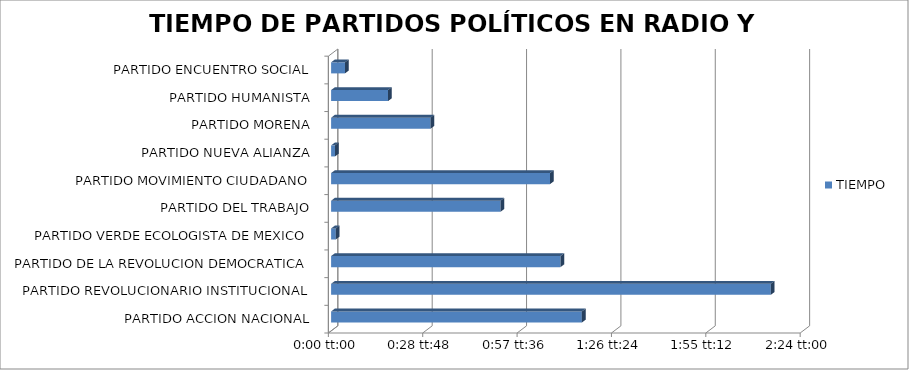
| Category | TIEMPO  |
|---|---|
| PARTIDO ACCION NACIONAL | 0.053 |
| PARTIDO REVOLUCIONARIO INSTITUCIONAL | 0.093 |
| PARTIDO DE LA REVOLUCION DEMOCRATICA | 0.049 |
| PARTIDO VERDE ECOLOGISTA DE MEXICO | 0.001 |
| PARTIDO DEL TRABAJO | 0.036 |
| PARTIDO MOVIMIENTO CIUDADANO | 0.046 |
| PARTIDO NUEVA ALIANZA | 0.001 |
| PARTIDO MORENA | 0.021 |
| PARTIDO HUMANISTA | 0.012 |
| PARTIDO ENCUENTRO SOCIAL | 0.003 |